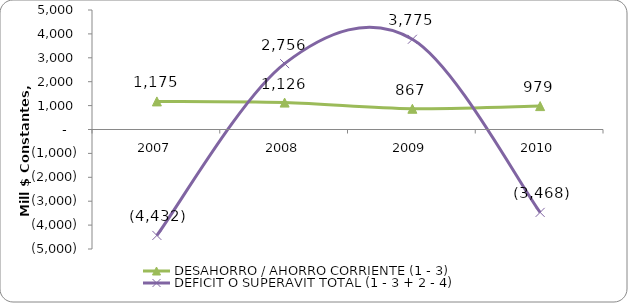
| Category | DESAHORRO / AHORRO CORRIENTE (1 - 3) | DEFICIT O SUPERAVIT TOTAL (1 - 3 + 2 - 4) |
|---|---|---|
| 2007 | 1175.421 | -4432.394 |
| 2008 | 1126.425 | 2755.507 |
| 2009 | 867.276 | 3775.248 |
| 2010 | 978.997 | -3467.905 |